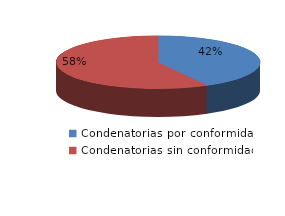
| Category | Series 0 |
|---|---|
| 0 | 58 |
| 1 | 80 |